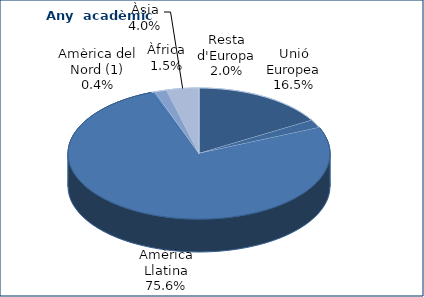
| Category | Series 0 |
|---|---|
| Unió Europea | 166 |
| Resta d'Europa | 20 |
| Amèrica Llatina | 759 |
| Amèrica del Nord (1) | 4 |
| Àfrica | 15 |
| Àsia | 40 |
| Oceania | 0 |